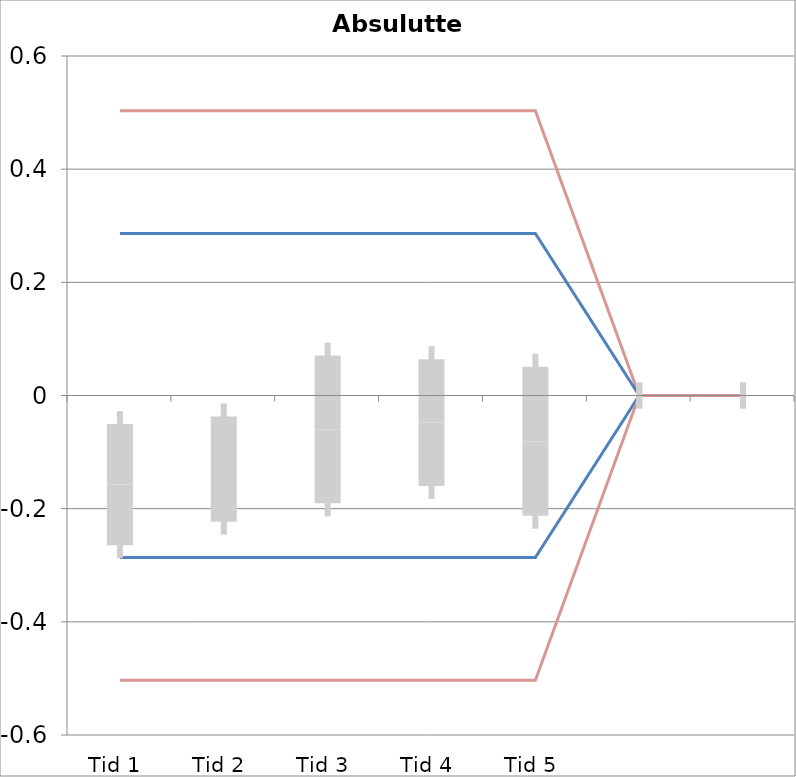
| Category | 1 | 2 | 3 | 4 | 5 | 6 | 7 | 8 | 9 | 10 | 11 | 12 | 13 | 14 | 15 | 16 | 17 | 18 | 19 | 20 | TEa | B | -B | -TEa | M |
|---|---|---|---|---|---|---|---|---|---|---|---|---|---|---|---|---|---|---|---|---|---|---|---|---|---|
| Tid 1 | -0.29 | -0.21 | -0.32 | 0.11 | 0 | 0 | -0.08 | -0.48 | -0.33 | -0.32 | -0.18 | -0.33 | -0.35 | 0.03 | 0.16 | -0.06 | 0.13 | 0 | 0 | 0 | 0.503 | 0.286 | -0.286 | -0.503 | -0.158 |
| Tid 2 | -0.19 | -0.33 | -0.23 | 0.16 | -0.02 | -0.25 | -0.15 | -0.33 | -0.06 | 0.06 | -0.03 | 0.04 | -0.36 | -0.13 | 0 | 0 | 0 | 0 | 0 | 0 | 0.503 | 0.286 | -0.286 | -0.503 | -0.13 |
| Tid 3 | -0.33 | -0.42 | -0.17 | 0.01 | 0.03 | 0.01 | 0.02 | -0.04 | 0.15 | -0.15 | -0.06 | 0.02 | -0.37 | 0.46 | 0 | 0 | 0 | 0 | 0 | 0 | 0.503 | 0.286 | -0.286 | -0.503 | -0.06 |
| Tid 4 | -0.22 | -0.18 | -0.24 | 0.12 | 0.21 | -0.08 | 0.07 | -0.08 | -0.13 | 0.15 | -0.03 | -0.15 | -0.4 | 0.29 | 0 | 0 | 0 | 0 | 0 | 0 | 0.503 | 0.286 | -0.286 | -0.503 | -0.048 |
| Tid 5 | 0 | 0 | -0.1 | 0.28 | -0.02 | -0.2 | 0 | -0.45 | -0.26 | 0.09 | -0.19 | -0.25 | -0.07 | 0.2 | 0 | 0 | 0 | 0 | 0 | 0 | 0.503 | 0.286 | -0.286 | -0.503 | -0.081 |